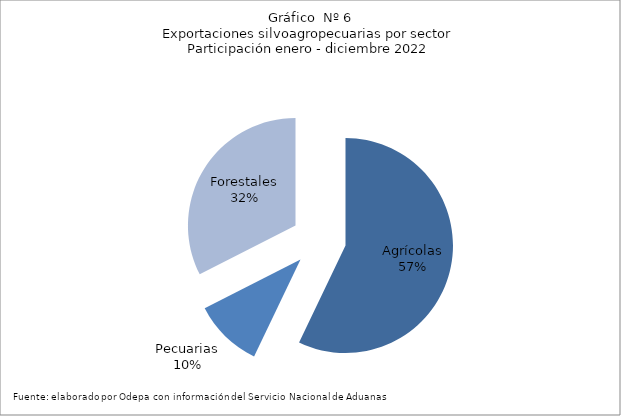
| Category | Series 0 |
|---|---|
| Agrícolas | 10612671 |
| Pecuarias | 1931207 |
| Forestales | 6039570 |